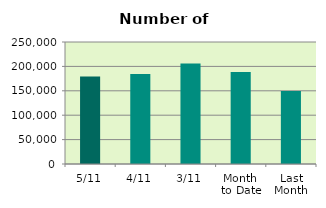
| Category | Series 0 |
|---|---|
| 5/11 | 179124 |
| 4/11 | 184520 |
| 3/11 | 205786 |
| Month 
to Date | 188609 |
| Last
Month | 149554.818 |